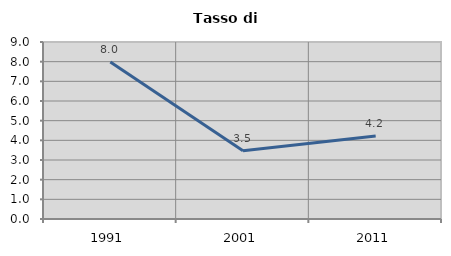
| Category | Tasso di disoccupazione   |
|---|---|
| 1991.0 | 7.977 |
| 2001.0 | 3.465 |
| 2011.0 | 4.225 |